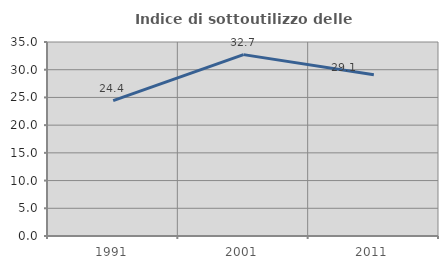
| Category | Indice di sottoutilizzo delle abitazioni  |
|---|---|
| 1991.0 | 24.422 |
| 2001.0 | 32.722 |
| 2011.0 | 29.094 |